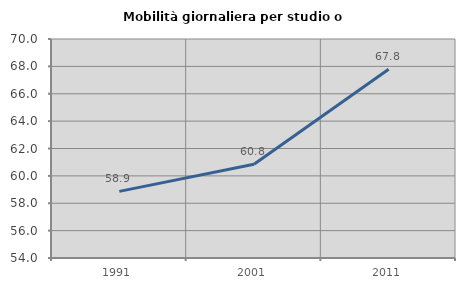
| Category | Mobilità giornaliera per studio o lavoro |
|---|---|
| 1991.0 | 58.867 |
| 2001.0 | 60.849 |
| 2011.0 | 67.791 |